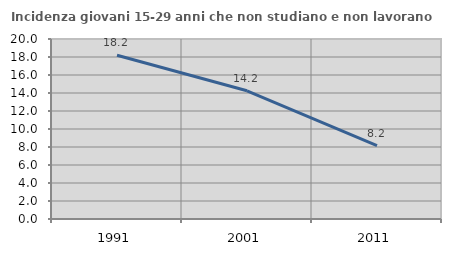
| Category | Incidenza giovani 15-29 anni che non studiano e non lavorano  |
|---|---|
| 1991.0 | 18.189 |
| 2001.0 | 14.243 |
| 2011.0 | 8.157 |